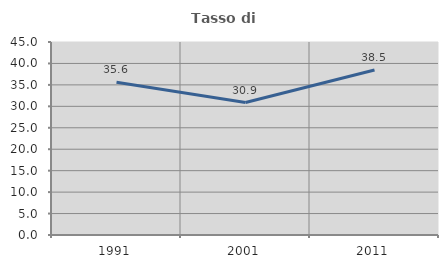
| Category | Tasso di occupazione   |
|---|---|
| 1991.0 | 35.636 |
| 2001.0 | 30.876 |
| 2011.0 | 38.479 |